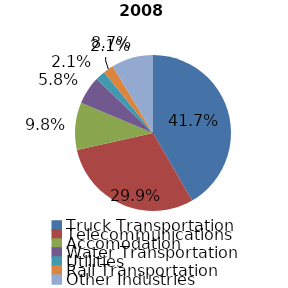
| Category | Series 0 |
|---|---|
| Truck Transportation | 1405 |
| Telecommunications | 1007 |
| Accomodation | 332 |
| Water Transportation | 196 |
| Utilities | 71 |
| Rail Transportation | 71 |
| Other Industries | 292 |